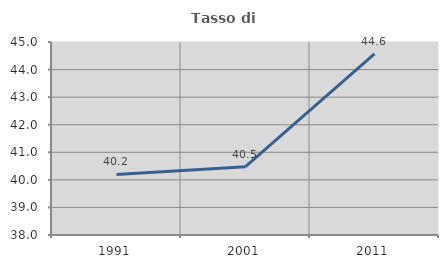
| Category | Tasso di occupazione   |
|---|---|
| 1991.0 | 40.196 |
| 2001.0 | 40.476 |
| 2011.0 | 44.571 |